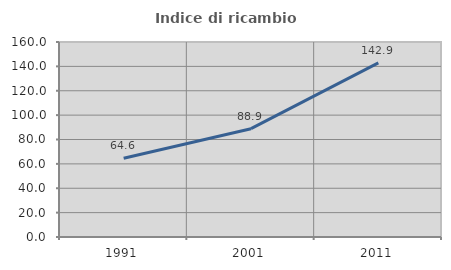
| Category | Indice di ricambio occupazionale  |
|---|---|
| 1991.0 | 64.646 |
| 2001.0 | 88.889 |
| 2011.0 | 142.857 |